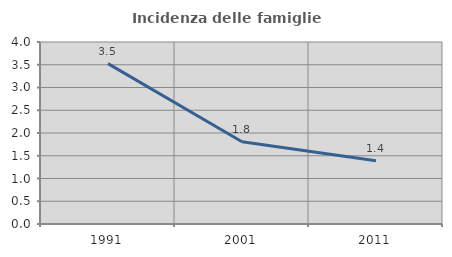
| Category | Incidenza delle famiglie numerose |
|---|---|
| 1991.0 | 3.525 |
| 2001.0 | 1.807 |
| 2011.0 | 1.392 |